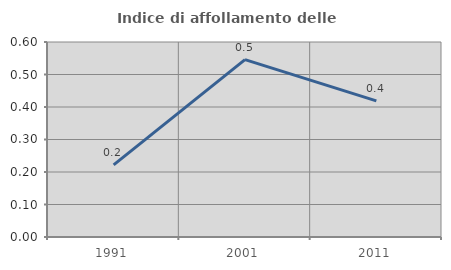
| Category | Indice di affollamento delle abitazioni  |
|---|---|
| 1991.0 | 0.222 |
| 2001.0 | 0.546 |
| 2011.0 | 0.419 |